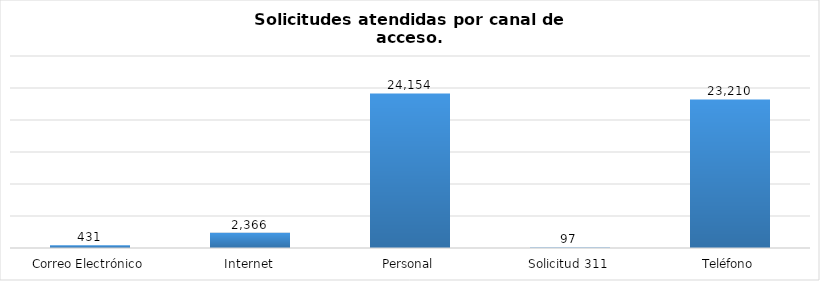
| Category | Total |
|---|---|
| Correo Electrónico | 431 |
| Internet | 2366 |
| Personal | 24154 |
| Solicitud 311 | 97 |
| Teléfono | 23210 |